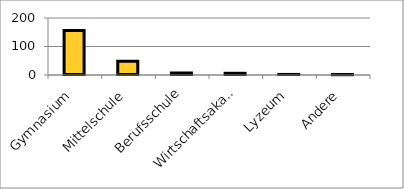
| Category | Series 0 |
|---|---|
| Gymnasium | 156 |
| Mittelschule | 48 |
| Berufsschule | 7 |
| Wirtschaftsakademie | 6 |
| Lyzeum | 2 |
| Andere | 1 |